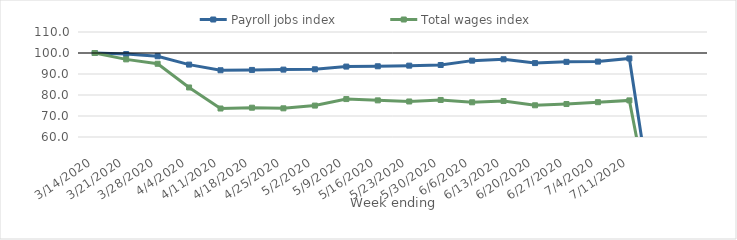
| Category | Payroll jobs index | Total wages index |
|---|---|---|
| 14/03/2020 | 100 | 100 |
| 21/03/2020 | 99.496 | 96.966 |
| 28/03/2020 | 98.46 | 94.872 |
| 04/04/2020 | 94.475 | 83.588 |
| 11/04/2020 | 91.784 | 73.571 |
| 18/04/2020 | 91.941 | 73.954 |
| 25/04/2020 | 92.085 | 73.656 |
| 02/05/2020 | 92.245 | 74.958 |
| 09/05/2020 | 93.534 | 78.059 |
| 16/05/2020 | 93.676 | 77.443 |
| 23/05/2020 | 93.979 | 76.913 |
| 30/05/2020 | 94.291 | 77.638 |
| 06/06/2020 | 96.364 | 76.527 |
| 13/06/2020 | 97.017 | 77.128 |
| 20/06/2020 | 95.199 | 75.103 |
| 27/06/2020 | 95.786 | 75.703 |
| 04/07/2020 | 95.903 | 76.583 |
| 11/07/2020 | 97.409 | 77.433 |